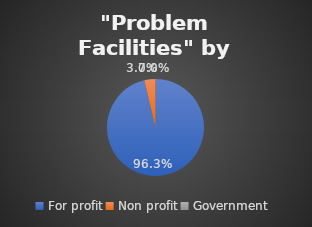
| Category | Series 0 |
|---|---|
| For profit | 0.963 |
| Non profit | 0.037 |
| Government | 0 |